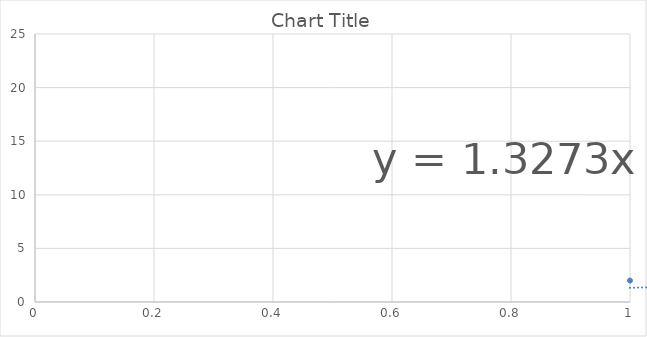
| Category | Series 0 |
|---|---|
| 0 | 2 |
| 1 | 4 |
| 2 | 6 |
| 3 | 7 |
| 4 | 7 |
| 5 | 17 |
| 6 | 8 |
| 7 | 9 |
| 8 | 20 |
| 9 | 1 |